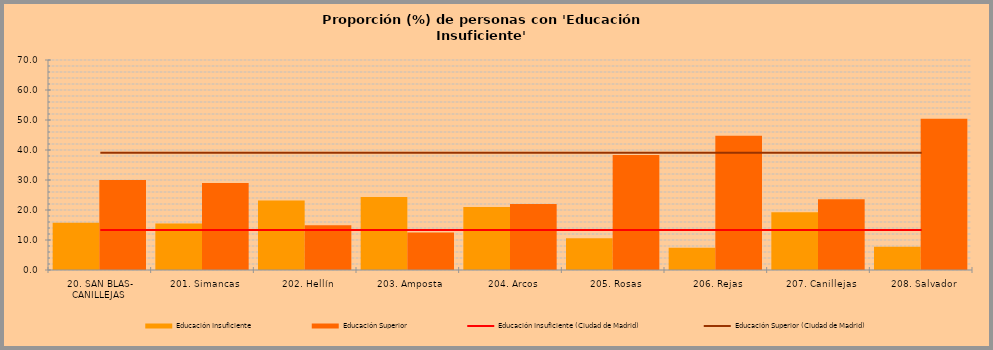
| Category | Educación Insuficiente | Educación Superior |
|---|---|---|
|  20. SAN BLAS- CANILLEJAS | 15.718 | 29.987 |
|    201. Simancas | 15.464 | 29.016 |
|    202. Hellín | 23.205 | 14.95 |
|    203. Amposta | 24.308 | 12.493 |
|    204. Arcos | 20.987 | 22.013 |
|    205. Rosas | 10.579 | 38.358 |
|    206. Rejas | 7.443 | 44.713 |
|    207. Canillejas | 19.216 | 23.545 |
|    208. Salvador | 7.786 | 50.394 |